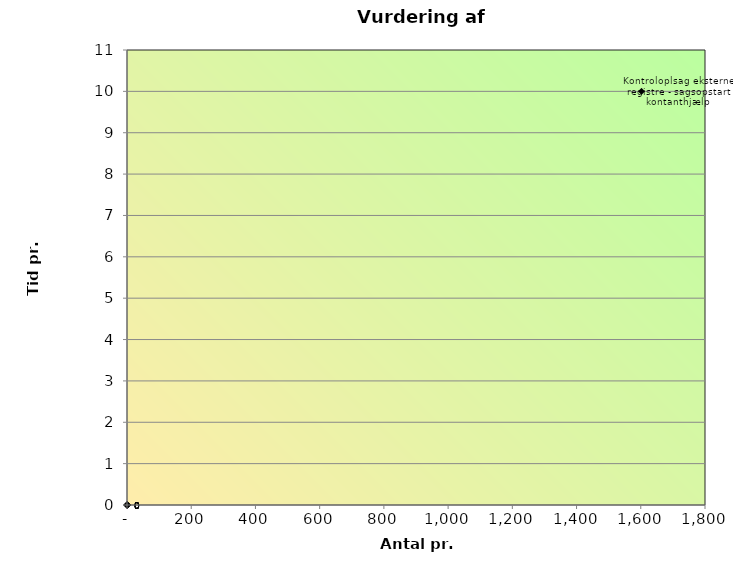
| Category | Tid |
|---|---|
| 1602.0 | 10 |
| 0.0 | 0 |
| 0.0 | 0 |
| 0.0 | 0 |
| 0.0 | 0 |
| 0.0 | 0 |
| 0.0 | 0 |
| 0.0 | 0 |
| 0.0 | 0 |
| 0.0 | 0 |
| 0.0 | 0 |
| 0.0 | 0 |